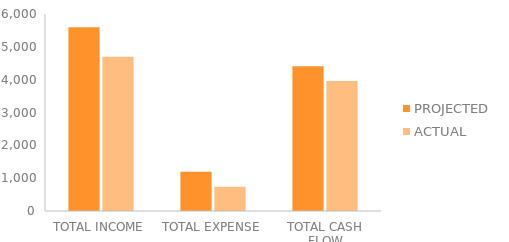
| Category | PROJECTED | ACTUAL |
|---|---|---|
| 0 | 5600 | 4700 |
| 1 | 1195 | 737 |
| 2 | 4405 | 3963 |